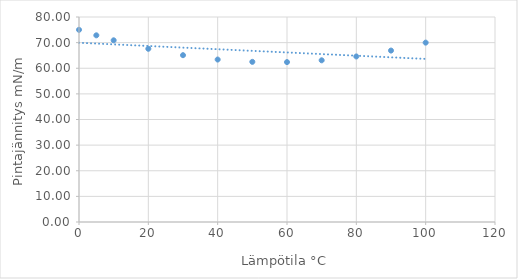
| Category | Series 0 |
|---|---|
| 0.0 | 75 |
| 5.0 | 72.85 |
| 10.0 | 70.9 |
| 20.0 | 67.6 |
| 30.0 | 65.1 |
| 40.0 | 63.4 |
| 50.0 | 62.5 |
| 60.0 | 62.4 |
| 70.0 | 63.1 |
| 80.0 | 64.6 |
| 90.0 | 66.9 |
| 100.0 | 70 |